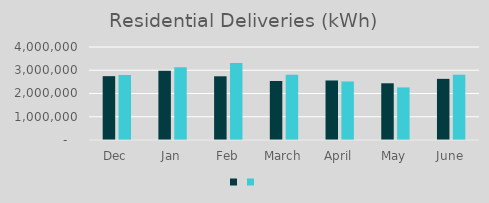
| Category | Series 1 | Series 0 |
|---|---|---|
| Dec | 2746090 | 2793607 |
| Jan | 2975165 | 3124442 |
| Feb | 2739688 | 3307618 |
| March | 2538769 | 2805250 |
| April | 2560197 | 2517652 |
| May | 2439036 | 2261207 |
| June | 2629934 | 2802052 |